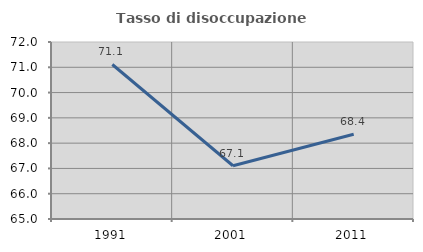
| Category | Tasso di disoccupazione giovanile  |
|---|---|
| 1991.0 | 71.111 |
| 2001.0 | 67.105 |
| 2011.0 | 68.354 |